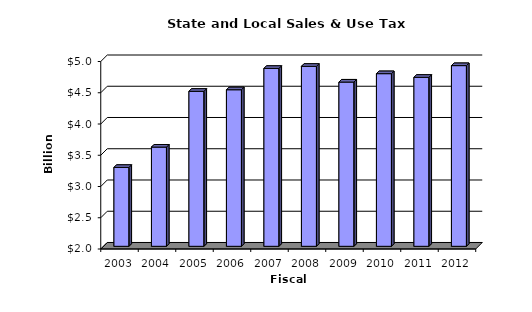
| Category | Series 0 |
|---|---|
| 2003.0 | 3.262 |
| 2004.0 | 3.587 |
| 2005.0 | 4.48 |
| 2006.0 | 4.505 |
| 2007.0 | 4.847 |
| 2008.0 | 4.88 |
| 2009.0 | 4.628 |
| 2010.0 | 4.762 |
| 2011.0 | 4.704 |
| 2012.0 | 4.891 |